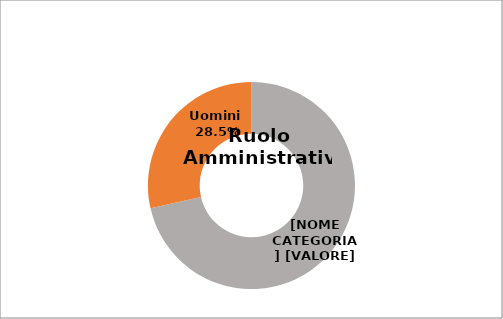
| Category | Series 0 |
|---|---|
| Donne  | 0.715 |
| Uomini  | 0.285 |